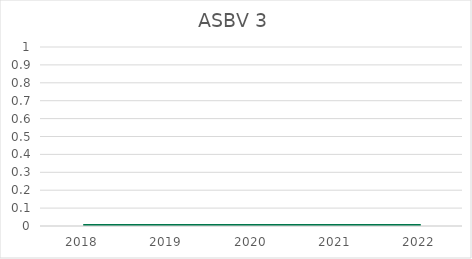
| Category | ASBV 3 |
|---|---|
| 2018.0 | 0 |
| 2019.0 | 0 |
| 2020.0 | 0 |
| 2021.0 | 0 |
| 2022.0 | 0 |